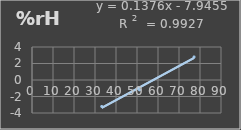
| Category | Humedad |
|---|---|
| 33.2 | -3.2 |
| 51.2 | -1.2 |
| 77.2 | 2.8 |